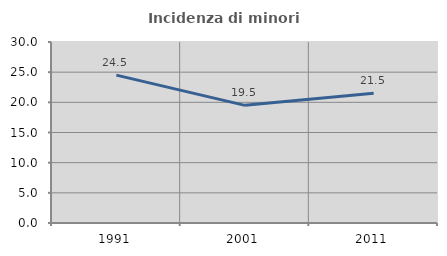
| Category | Incidenza di minori stranieri |
|---|---|
| 1991.0 | 24.516 |
| 2001.0 | 19.499 |
| 2011.0 | 21.505 |